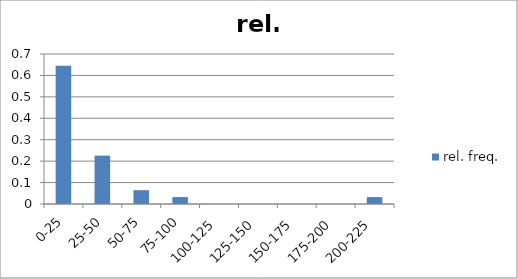
| Category | rel. freq. |
|---|---|
| 0-25 | 0.645 |
| 25-50 | 0.226 |
| 50-75 | 0.065 |
| 75-100 | 0.032 |
| 100-125 | 0 |
| 125-150 | 0 |
| 150-175 | 0 |
| 175-200 | 0 |
| 200-225 | 0.032 |